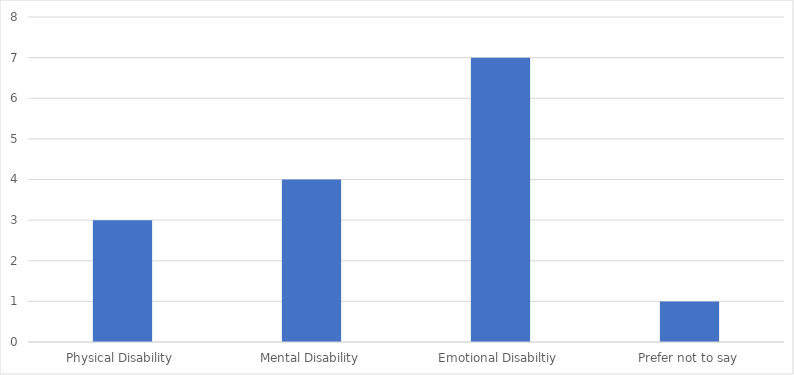
| Category | Number of Responses |
|---|---|
| Physical Disability | 3 |
| Mental Disability | 4 |
| Emotional Disabiltiy | 7 |
| Prefer not to say | 1 |